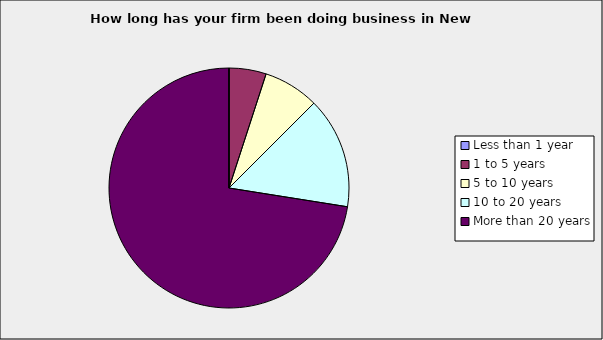
| Category | Series 0 |
|---|---|
| Less than 1 year | 0 |
| 1 to 5 years | 0.05 |
| 5 to 10 years | 0.075 |
| 10 to 20 years | 0.15 |
| More than 20 years | 0.725 |